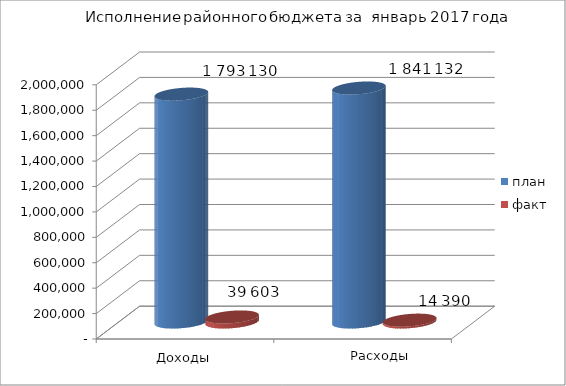
| Category | план | факт |
|---|---|---|
| 0 | 1793130 | 39603 |
| 1 | 1841132 | 14390 |